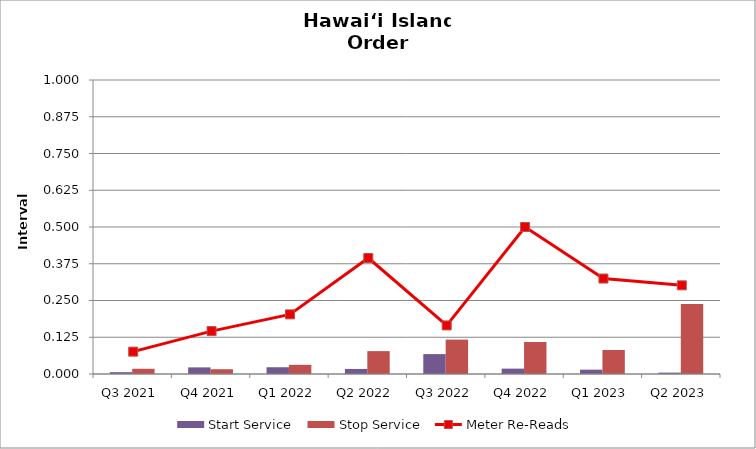
| Category | Start Service | Stop Service |
|---|---|---|
| Q3 2021 | 0.006 | 0.018 |
| Q4 2021 | 0.022 | 0.016 |
| Q1 2022 | 0.023 | 0.031 |
| Q2 2022 | 0.017 | 0.078 |
| Q3 2022 | 0.068 | 0.117 |
| Q4 2022 | 0.018 | 0.109 |
| Q1 2023 | 0.015 | 0.082 |
| Q2 2023 | 0.005 | 0.238 |